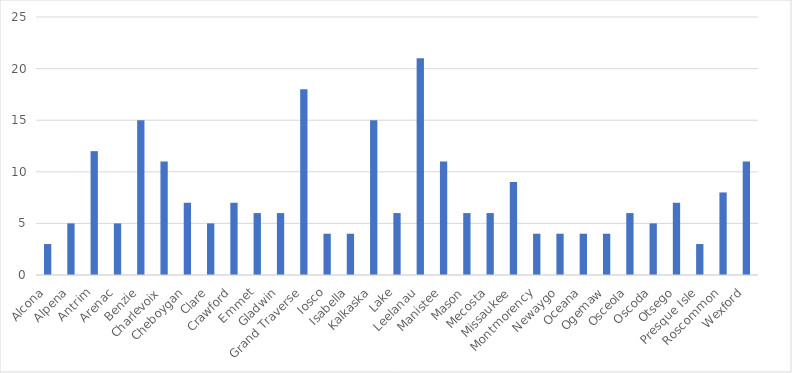
| Category | Number of Responses |
|---|---|
| Alcona | 3 |
| Alpena | 5 |
| Antrim | 12 |
| Arenac | 5 |
| Benzie | 15 |
| Charlevoix | 11 |
| Cheboygan | 7 |
| Clare | 5 |
| Crawford | 7 |
| Emmet | 6 |
| Gladwin | 6 |
| Grand Traverse | 18 |
| Iosco | 4 |
| Isabella | 4 |
| Kalkaska | 15 |
| Lake | 6 |
| Leelanau | 21 |
| Manistee | 11 |
| Mason | 6 |
| Mecosta | 6 |
| Missaukee | 9 |
| Montmorency | 4 |
| Newaygo | 4 |
| Oceana | 4 |
| Ogemaw | 4 |
| Osceola | 6 |
| Oscoda | 5 |
| Otsego | 7 |
| Presque Isle | 3 |
| Roscommon | 8 |
| Wexford | 11 |